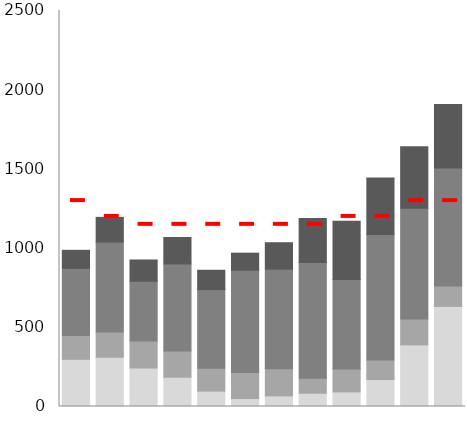
| Category | Donuts | Danish | Coffee | Tea |
|---|---|---|---|---|
| Jan | 298 | 150 | 424 | 114 |
| Feb | 311 | 160 | 567 | 156 |
| Mar | 243 | 170 | 378 | 134 |
| Apr | 185 | 165 | 550 | 167 |
| May | 97 | 144 | 497 | 122 |
| Jun | 50 | 165 | 645 | 108 |
| Jul | 67 | 172 | 628 | 167 |
| Aug | 84 | 94 | 731 | 278 |
| Sep | 92 | 144 | 566 | 367 |
| Oct | 170 | 123 | 793 | 356 |
| Nov | 389 | 163 | 699 | 389 |
| Dec | 632 | 128 | 745 | 402 |